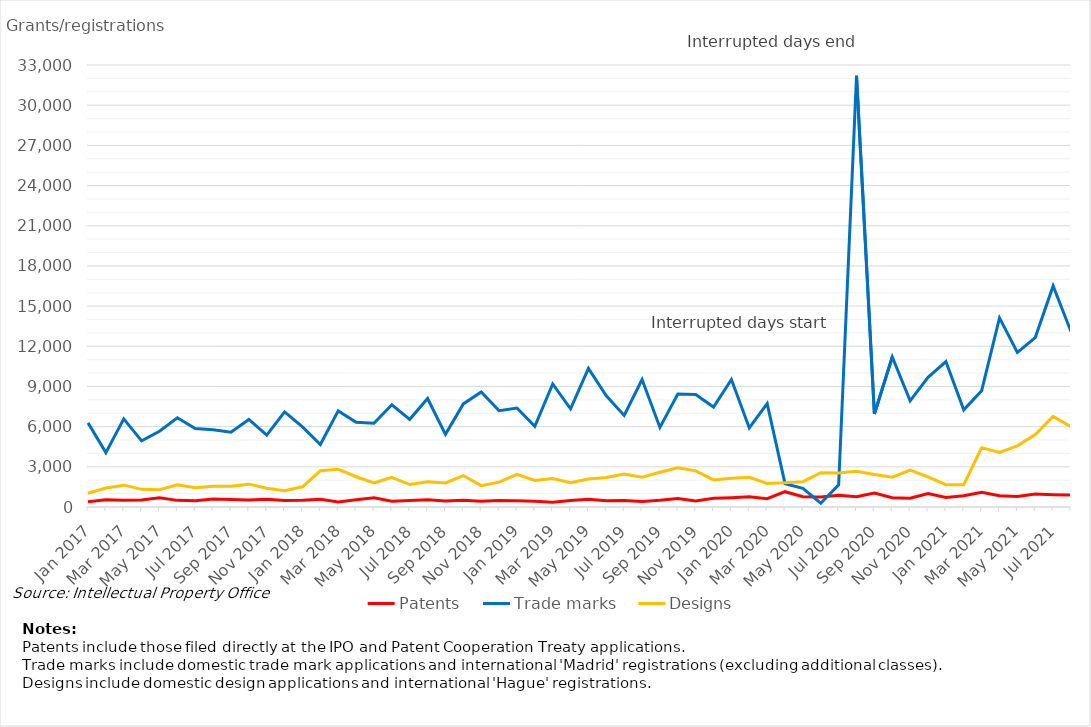
| Category | Patents | Trade marks | Designs |
|---|---|---|---|
| Jan 2017 | 387 | 6288 | 1026 |
| Feb 2017 | 533 | 4063 | 1420 |
| Mar 2017 | 505 | 6576 | 1631 |
| Apr 2017 | 516 | 4937 | 1318 |
| May 2017 | 681 | 5651 | 1284 |
| Jun 2017 | 495 | 6659 | 1660 |
| Jul 2017 | 466 | 5857 | 1437 |
| Aug 2017 | 592 | 5763 | 1550 |
| Sep 2017 | 554 | 5578 | 1553 |
| Oct 2017 | 517 | 6539 | 1705 |
| Nov 2017 | 578 | 5364 | 1397 |
| Dec 2017 | 487 | 7101 | 1218 |
| Jan 2018 | 495 | 5978 | 1512 |
| Feb 2018 | 574 | 4670 | 2704 |
| Mar 2018 | 370 | 7176 | 2825 |
| Apr 2018 | 543 | 6332 | 2259 |
| May 2018 | 690 | 6251 | 1789 |
| Jun 2018 | 424 | 7636 | 2222 |
| Jul 2018 | 486 | 6547 | 1678 |
| Aug 2018 | 536 | 8103 | 1878 |
| Sep 2018 | 450 | 5426 | 1795 |
| Oct 2018 | 498 | 7699 | 2348 |
| Nov 2018 | 432 | 8591 | 1592 |
| Dec 2018 | 484 | 7189 | 1859 |
| Jan 2019 | 475 | 7393 | 2444 |
| Feb 2019 | 426 | 6021 | 1987 |
| Mar 2019 | 363 | 9184 | 2125 |
| Apr 2019 | 488 | 7335 | 1810 |
| May 2019 | 573 | 10345 | 2096 |
| Jun 2019 | 471 | 8304 | 2202 |
| Jul 2019 | 489 | 6839 | 2464 |
| Aug 2019 | 420 | 9515 | 2218 |
| Sep 2019 | 500 | 5942 | 2596 |
| Oct 2019 | 634 | 8436 | 2926 |
| Nov 2019 | 455 | 8398 | 2700 |
| Dec 2019 | 654 | 7465 | 2021 |
| Jan 2020 | 696 | 9517 | 2145 |
| Feb 2020 | 756 | 5905 | 2220 |
| Mar 2020 | 622 | 7719 | 1758 |
| Apr 2020 | 1143 | 1741 | 1803 |
| May 2020 | 768 | 1398 | 1888 |
| Jun 2020 | 740 | 280 | 2564 |
| Jul 2020 | 878 | 1657 | 2539 |
| Aug 2020 | 771 | 32198 | 2665 |
| Sep 2020 | 1042 | 6941 | 2425 |
| Oct 2020 | 697 | 11197 | 2223 |
| Nov 2020 | 649 | 7926 | 2763 |
| Dec 2020 | 1010 | 9680 | 2252 |
| Jan 2021 | 708 | 10856 | 1665 |
| Feb 2021 | 838 | 7254 | 1661 |
| Mar 2021 | 1107 | 8685 | 4430 |
| Apr 2021 | 838 | 14120 | 4080 |
| May 2021 | 788 | 11545 | 4569 |
| Jun 2021 | 972 | 12652 | 5414 |
| Jul 2021 | 918 | 16506 | 6764 |
| Aug 2021 | 887 | 13099 | 5984 |